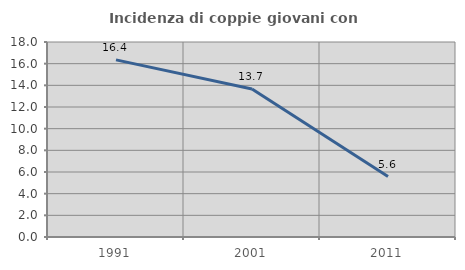
| Category | Incidenza di coppie giovani con figli |
|---|---|
| 1991.0 | 16.352 |
| 2001.0 | 13.661 |
| 2011.0 | 5.584 |